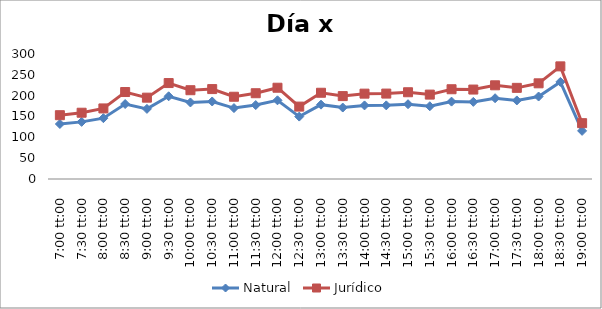
| Category | Natural | Jurídico |
|---|---|---|
| 0.2916666666666667 | 132.005 | 153.125 |
| 0.3125 | 137.111 | 159.049 |
| 0.3333333333333333 | 146.013 | 169.375 |
| 0.3541666666666667 | 179.946 | 208.737 |
| 0.375 | 168.269 | 195.192 |
| 0.3958333333333333 | 198.507 | 230.268 |
| 0.4166666666666667 | 183.705 | 213.097 |
| 0.4375 | 186.038 | 215.804 |
| 0.4583333333333333 | 170.19 | 197.421 |
| 0.4791666666666667 | 177.453 | 205.846 |
| 0.5 | 188.854 | 219.071 |
| 0.5208333333333334 | 149.779 | 173.744 |
| 0.5416666666666666 | 178.441 | 206.992 |
| 0.5625 | 171.509 | 198.951 |
| 0.5833333333333334 | 176.588 | 204.843 |
| 0.6041666666666666 | 176.732 | 205.009 |
| 0.625 | 179.503 | 208.223 |
| 0.6458333333333334 | 174.623 | 202.562 |
| 0.6666666666666666 | 185.711 | 215.425 |
| 0.6875 | 185.07 | 214.681 |
| 0.7083333333333334 | 193.862 | 224.88 |
| 0.7291666666666666 | 188.585 | 218.759 |
| 0.75 | 197.956 | 229.629 |
| 0.7708333333333334 | 233.041 | 270.328 |
| 0.7916666666666666 | 115.508 | 133.989 |